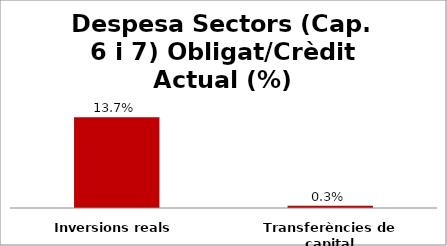
| Category | Series 0 |
|---|---|
| Inversions reals | 0.137 |
| Transferències de capital | 0.003 |